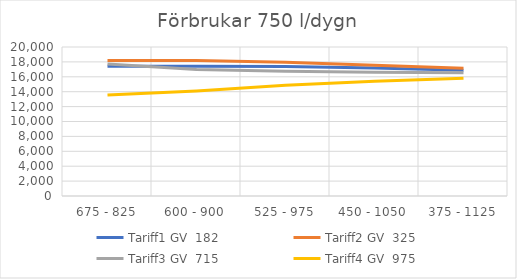
| Category | Tariff1 GV  | Tariff2 GV  | Tariff3 GV  | Tariff4 GV  |
|---|---|---|---|---|
| 675 - 825 | 17421.45 | 18204.375 | 17718.359 | 13561.712 |
| 600 - 900 | 17420.793 | 18185.24 | 16980.302 | 14099.302 |
| 525 - 975 | 17373.243 | 17963.092 | 16755.69 | 14853.62 |
| 450 - 1050 | 17180.167 | 17565.442 | 16625.604 | 15411.824 |
| 375 - 1125 | 16883.367 | 17142.992 | 16527.875 | 15802.903 |